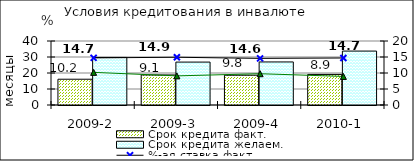
| Category | Срок кредита факт.  | Срок кредита желаем. |
|---|---|---|
| 2009-2 | 16.11 | 29.71 |
| 2009-3 | 18.77 | 26.82 |
| 2009-4 | 18.61 | 26.91 |
| 2010-1 | 19.11 | 33.71 |